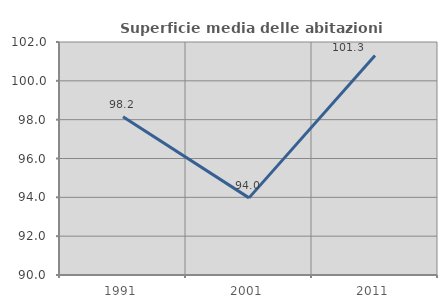
| Category | Superficie media delle abitazioni occupate |
|---|---|
| 1991.0 | 98.152 |
| 2001.0 | 93.972 |
| 2011.0 | 101.304 |